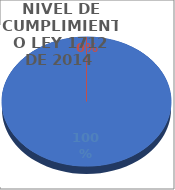
| Category | Series 0 |
|---|---|
| CUMPLIDOS | 121 |
| NO CUMPLIDOS | 0 |